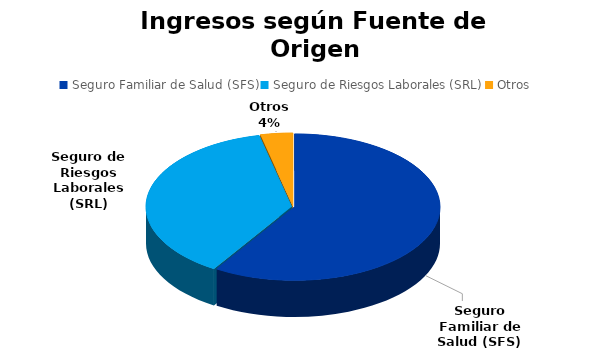
| Category | Series 0 |
|---|---|
| Seguro Familiar de Salud (SFS) | 593093975.45 |
| Seguro de Riesgos Laborales (SRL) | 376868065.86 |
| Otros | 36137815.62 |